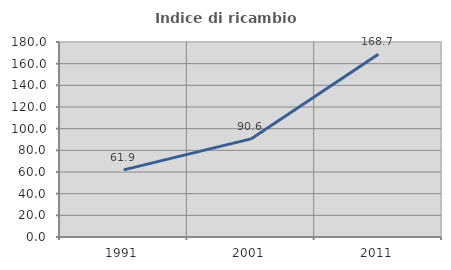
| Category | Indice di ricambio occupazionale  |
|---|---|
| 1991.0 | 61.94 |
| 2001.0 | 90.566 |
| 2011.0 | 168.687 |